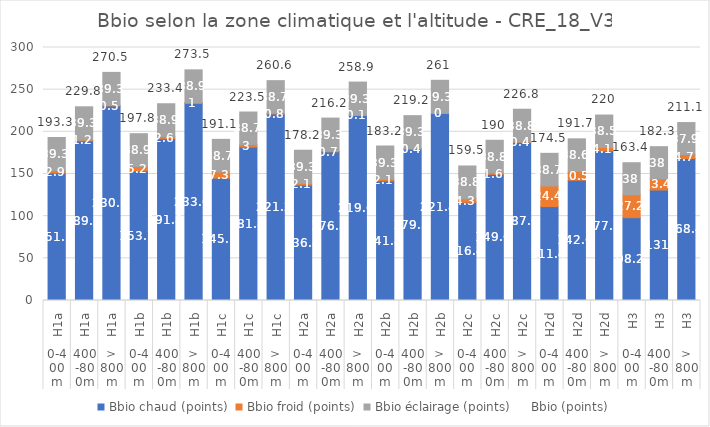
| Category | Bbio chaud (points) | Bbio froid (points) | Bbio éclairage (points) |
|---|---|---|---|
| 0 | 151.1 | 2.9 | 39.3 |
| 1 | 189.2 | 1.2 | 39.3 |
| 2 | 230.7 | 0.5 | 39.3 |
| 3 | 153.7 | 5.2 | 38.9 |
| 4 | 191.8 | 2.6 | 38.9 |
| 5 | 233.6 | 1 | 38.9 |
| 6 | 145.1 | 7.3 | 38.7 |
| 7 | 181.8 | 3 | 38.7 |
| 8 | 221.2 | 0.8 | 38.7 |
| 9 | 136.8 | 2.1 | 39.3 |
| 10 | 176.3 | 0.7 | 39.3 |
| 11 | 219.6 | 0.1 | 39.3 |
| 12 | 141.8 | 2.1 | 39.3 |
| 13 | 179.5 | 0.4 | 39.3 |
| 14 | 221.8 | 0 | 39.3 |
| 15 | 116.4 | 4.3 | 38.8 |
| 16 | 149.6 | 1.6 | 38.8 |
| 17 | 187.6 | 0.4 | 38.8 |
| 18 | 111.4 | 24.4 | 38.7 |
| 19 | 142.6 | 10.5 | 38.6 |
| 20 | 177.3 | 4.1 | 38.5 |
| 21 | 98.2 | 27.2 | 38 |
| 22 | 131 | 13.4 | 38 |
| 23 | 168.4 | 4.7 | 37.9 |